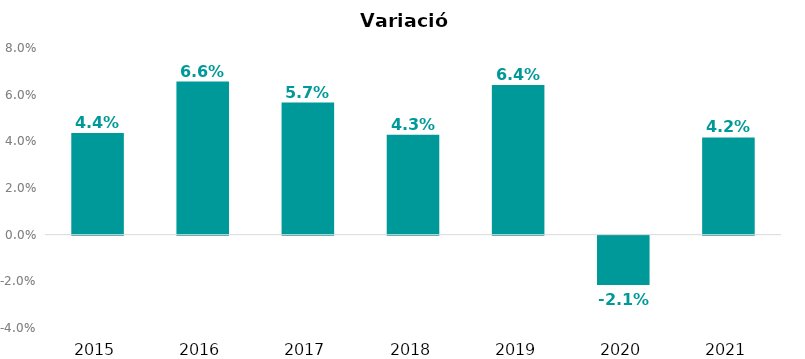
| Category | Variació interanual |
|---|---|
| 2015.0 | 0.044 |
| 2016.0 | 0.066 |
| 2017.0 | 0.057 |
| 2018.0 | 0.043 |
| 2019.0 | 0.064 |
| 2020.0 | -0.021 |
| 2021.0 | 0.042 |